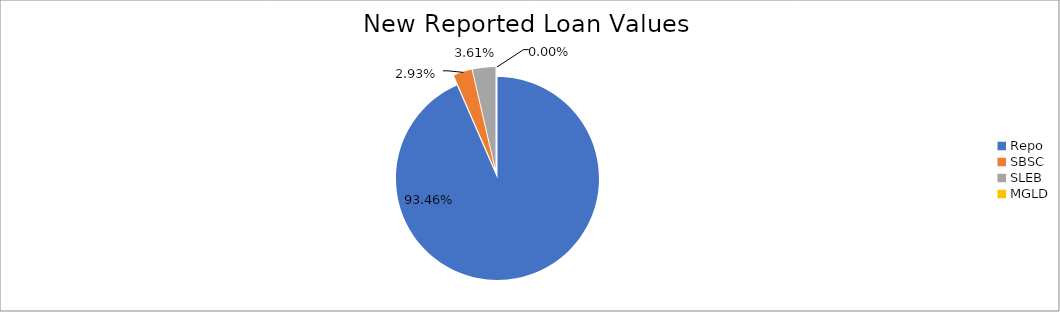
| Category | Series 0 |
|---|---|
| Repo | 9382529.123 |
| SBSC | 294010.833 |
| SLEB | 362927.688 |
| MGLD | 139.078 |